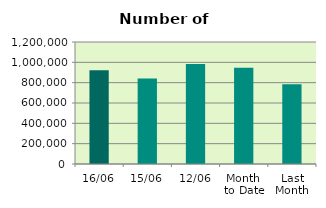
| Category | Series 0 |
|---|---|
| 16/06 | 922366 |
| 15/06 | 840416 |
| 12/06 | 983288 |
| Month 
to Date | 947413.167 |
| Last
Month | 785067 |